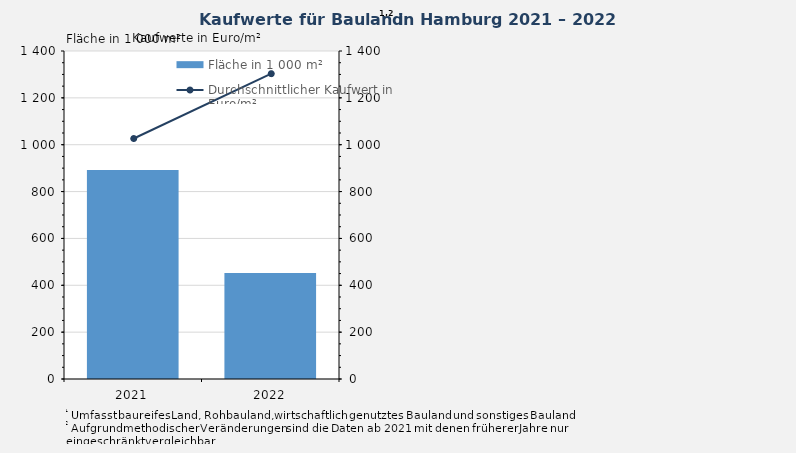
| Category | Fläche in 1 000 m² |
|---|---|
| 2021.0 | 892 |
| 2022.0 | 452 |